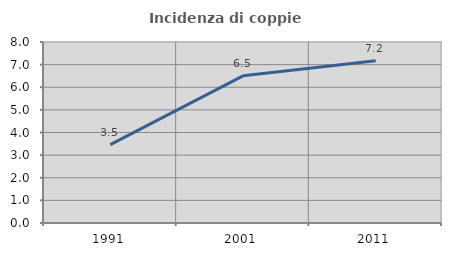
| Category | Incidenza di coppie miste |
|---|---|
| 1991.0 | 3.463 |
| 2001.0 | 6.504 |
| 2011.0 | 7.168 |